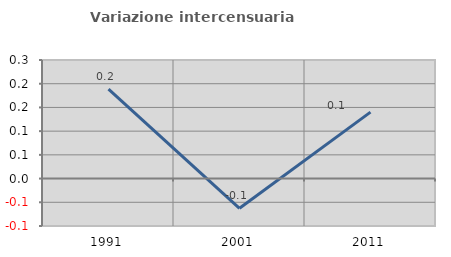
| Category | Variazione intercensuaria annua |
|---|---|
| 1991.0 | 0.189 |
| 2001.0 | -0.063 |
| 2011.0 | 0.14 |